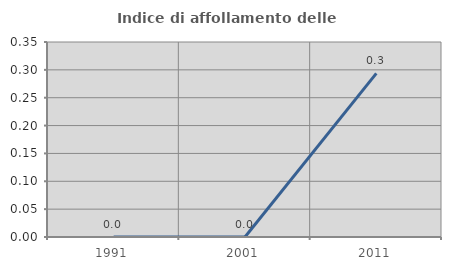
| Category | Indice di affollamento delle abitazioni  |
|---|---|
| 1991.0 | 0 |
| 2001.0 | 0 |
| 2011.0 | 0.294 |